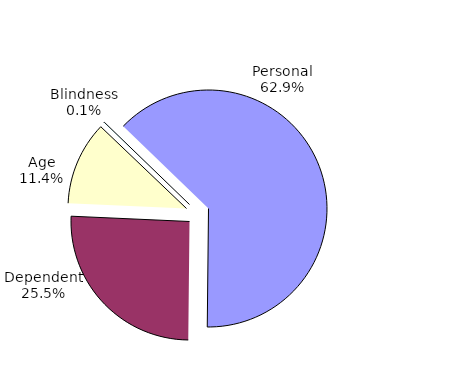
| Category | Series 0 |
|---|---|
| Personal | 5585486 |
| Dependent | 2266781 |
| Age | 1012508 |
| Blindness | 8838 |